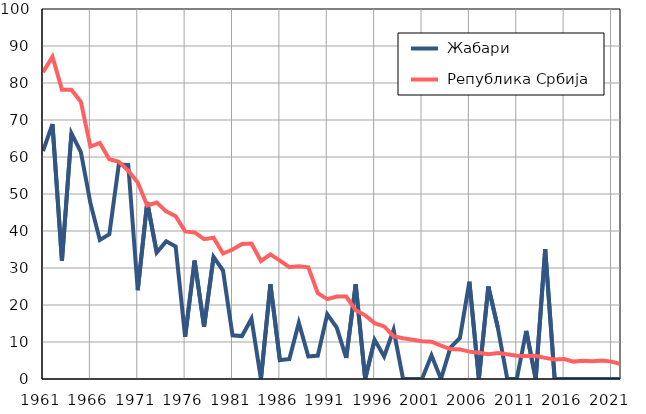
| Category |  Жабари |  Република Србија |
|---|---|---|
| 1961.0 | 61.6 | 82.9 |
| 1962.0 | 68.9 | 87.1 |
| 1963.0 | 31.9 | 78.2 |
| 1964.0 | 66.4 | 78.2 |
| 1965.0 | 61.3 | 74.9 |
| 1966.0 | 47.6 | 62.8 |
| 1967.0 | 37.6 | 63.8 |
| 1968.0 | 39.1 | 59.4 |
| 1969.0 | 58 | 58.7 |
| 1970.0 | 57.8 | 56.3 |
| 1971.0 | 24 | 53.1 |
| 1972.0 | 47.8 | 46.9 |
| 1973.0 | 34.2 | 47.7 |
| 1974.0 | 37.2 | 45.3 |
| 1975.0 | 35.8 | 44 |
| 1976.0 | 11.4 | 39.9 |
| 1977.0 | 32 | 39.6 |
| 1978.0 | 14.1 | 37.8 |
| 1979.0 | 33 | 38.2 |
| 1980.0 | 29.3 | 33.9 |
| 1981.0 | 11.8 | 35 |
| 1982.0 | 11.6 | 36.5 |
| 1983.0 | 16.3 | 36.6 |
| 1984.0 | 0 | 31.9 |
| 1985.0 | 25.6 | 33.7 |
| 1986.0 | 5.1 | 32 |
| 1987.0 | 5.4 | 30.2 |
| 1988.0 | 15.2 | 30.5 |
| 1989.0 | 6.1 | 30.2 |
| 1990.0 | 6.3 | 23.2 |
| 1991.0 | 17.5 | 21.6 |
| 1992.0 | 13.9 | 22.3 |
| 1993.0 | 5.7 | 22.3 |
| 1994.0 | 25.6 | 18.6 |
| 1995.0 | 0 | 17.2 |
| 1996.0 | 10.6 | 15.1 |
| 1997.0 | 6.1 | 14.2 |
| 1998.0 | 13.3 | 11.6 |
| 1999.0 | 0 | 11 |
| 2000.0 | 0 | 10.6 |
| 2001.0 | 0 | 10.2 |
| 2002.0 | 6.4 | 10.1 |
| 2003.0 | 0 | 9 |
| 2004.0 | 8.5 | 8.1 |
| 2005.0 | 11.1 | 8 |
| 2006.0 | 26.3 | 7.4 |
| 2007.0 | 0 | 7.1 |
| 2008.0 | 25 | 6.7 |
| 2009.0 | 13.9 | 7 |
| 2010.0 | 0 | 6.7 |
| 2011.0 | 0 | 6.3 |
| 2012.0 | 13 | 6.2 |
| 2013.0 | 0 | 6.3 |
| 2014.0 | 35.1 | 5.7 |
| 2015.0 | 0 | 5.3 |
| 2016.0 | 0 | 5.4 |
| 2017.0 | 0 | 4.7 |
| 2018.0 | 0 | 4.9 |
| 2019.0 | 0 | 4.8 |
| 2020.0 | 0 | 5 |
| 2021.0 | 0 | 4.7 |
| 2022.0 | 0 | 4 |